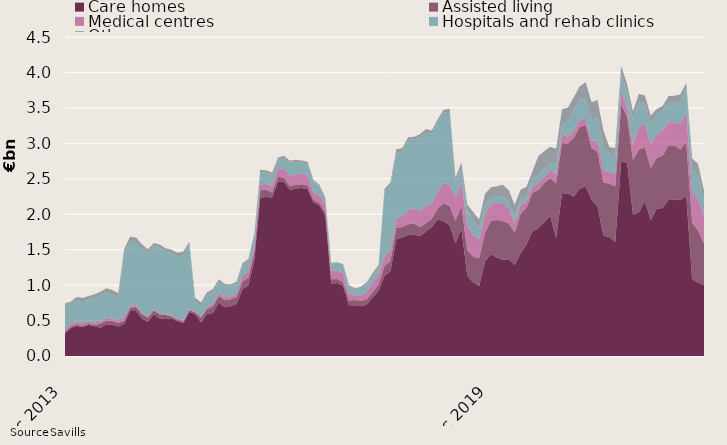
| Category | Care homes | Assisted living | Medical centres | Hospitals and rehab clinics | Other |
|---|---|---|---|---|---|
| 2013-12-01 | 316072110 | 21150000 | 36229348 | 338787993 | 26674299 |
| 2014-01-01 | 396122000 | 21150000 | 36229348 | 301467992 | 14024299 |
| 2014-02-01 | 423017999 | 16996000 | 41229348 | 301467992 | 49024299 |
| 2014-03-01 | 409587999 | 16996000 | 33896100 | 297467994 | 60915344 |
| 2014-04-01 | 436479999 | 16996000 | 38896100 | 299927994 | 54915344 |
| 2014-05-01 | 420451999 | 12372000 | 38896100 | 345627991 | 54915344 |
| 2014-06-01 | 400251999 | 53047000 | 38896100 | 360127987 | 54915344 |
| 2014-07-01 | 447606996 | 53047000 | 35000000 | 357127989 | 63009744 |
| 2014-08-01 | 442116996 | 53047000 | 35000000 | 337739742 | 63009744 |
| 2014-09-01 | 416316995 | 46247000 | 47499999 | 307299740 | 67509743 |
| 2014-10-01 | 450246995 | 46247000 | 47499999 | 901299740 | 65760544 |
| 2014-11-01 | 633736081 | 43759854 | 35999999 | 904699738 | 65760544 |
| 2014-12-01 | 633736081 | 57759854 | 25749999 | 891599738 | 64340644 |
| 2015-01-01 | 530736081 | 57759854 | 25749999 | 891599738 | 71465644 |
| 2015-02-01 | 483168082 | 57759854 | 20749999 | 896099737 | 47465644 |
| 2015-03-01 | 584248082 | 57759854 | 20749999 | 897080987 | 35574599 |
| 2015-04-01 | 529356082 | 57759854 | 15749999 | 924420986 | 46426599 |
| 2015-05-01 | 520608080 | 57759854 | 15749999 | 878720989 | 46426599 |
| 2015-06-01 | 533256112 | 23084854 | 15749999 | 876900990 | 49446599 |
| 2015-07-01 | 490421115 | 23084854 | 15749999 | 875398489 | 52902199 |
| 2015-08-01 | 463331115 | 23084854 | 22535999 | 907658735 | 59202199 |
| 2015-09-01 | 621256115 | 25684854 | 16839999 | 894158738 | 54702200 |
| 2015-10-01 | 587326115 | 25684854 | 16839999 | 139658736 | 52047000 |
| 2015-11-01 | 471877887 | 72825922 | 16839999 | 139508737 | 52047000 |
| 2015-12-01 | 593556246 | 68890922 | 27614999 | 157908739 | 52496999 |
| 2016-01-01 | 606656246 | 93190922 | 41614999 | 153408740 | 50721998 |
| 2016-02-01 | 754539246 | 93190922 | 41614999 | 153858740 | 39721998 |
| 2016-03-01 | 687824246 | 98850422 | 41614999 | 149377489 | 39721998 |
| 2016-04-01 | 701548246 | 98850422 | 41614999 | 136827489 | 28869998 |
| 2016-05-01 | 734016248 | 98850422 | 41614999 | 136827489 | 37869998 |
| 2016-06-01 | 941523216 | 109570422 | 83842999 | 134147490 | 39449998 |
| 2016-07-01 | 997563216 | 109570422 | 83842999 | 153319989 | 28209997 |
| 2016-08-01 | 1353063216 | 109570422 | 80368999 | 163139991 | 26909995 |
| 2016-09-01 | 2236038217 | 106970422 | 78890000 | 174533091 | 31909995 |
| 2016-10-01 | 2242038217 | 106970422 | 78890000 | 160033093 | 30909995 |
| 2016-11-01 | 2237654905 | 70446953 | 92390000 | 156208094 | 32409994 |
| 2016-12-01 | 2458976545 | 74801952 | 115752000 | 118658093 | 33459994 |
| 2017-01-01 | 2457326544 | 55001951 | 125059800 | 158158090 | 28109995 |
| 2017-02-01 | 2342511544 | 55001951 | 149359800 | 178733089 | 28109995 |
| 2017-03-01 | 2363283207 | 49342451 | 149359800 | 177233090 | 28109995 |
| 2017-04-01 | 2371659207 | 49792450 | 149359800 | 159983091 | 28109995 |
| 2017-05-01 | 2351709207 | 54792450 | 149359800 | 164483090 | 19109995 |
| 2017-06-01 | 2165904207 | 38072450 | 107131800 | 154483091 | 16259995 |
| 2017-07-01 | 2122064206 | 38072450 | 107131800 | 133313092 | 14749996 |
| 2017-08-01 | 1987264211 | 38072450 | 111838800 | 93893091 | 9749998 |
| 2017-09-01 | 1022249210 | 59156450 | 121613798 | 101239339 | 11749996 |
| 2017-10-01 | 1028249210 | 59156450 | 122794094 | 101239339 | 11749996 |
| 2017-11-01 | 993351664 | 51823997 | 121994094 | 110189339 | 19607117 |
| 2017-12-01 | 717528269.65 | 64485392.34 | 91375634 | 109439340 | 20394618 |
| 2018-01-01 | 716093269.65 | 73735393.34 | 68067834 | 74639342 | 22894617 |
| 2018-02-01 | 702731268.65 | 75083233.34 | 76967834 | 100209344 | 22894617 |
| 2018-03-01 | 726239605.65 | 75083233.34 | 101967834 | 100209344 | 37894617 |
| 2018-04-01 | 823219606.65 | 74633234.34 | 134166234 | 102309343 | 37894617 |
| 2018-05-01 | 915642106.65 | 94273234.34 | 134166234 | 97809344 | 43894617 |
| 2018-06-01 | 1127762106.65 | 138273234.34 | 134166234 | 912809344 | 42144617 |
| 2018-07-01 | 1195392105.65 | 143673234.34 | 145666234 | 910309345 | 51944617 |
| 2018-08-01 | 1648382098.65 | 157723234.34 | 137647234 | 919564346 | 51944617 |
| 2018-09-01 | 1672277099.66 | 147639234.34 | 158043236 | 907324998 | 44944619 |
| 2018-10-01 | 1707357099.66 | 151089234.34 | 195391740 | 988324994 | 44944619 |
| 2018-11-01 | 1711797099.66 | 155979234.34 | 214712300 | 974149994 | 37837498 |
| 2018-12-01 | 1689070494.01 | 128897840 | 232943760 | 1040049993 | 35549998 |
| 2019-01-01 | 1756635495.01 | 115597839 | 246203760 | 1035349994 | 46839999 |
| 2019-02-01 | 1821157496.01 | 114249999 | 213003760 | 985490494 | 46839999 |
| 2019-03-01 | 1925204184.01 | 156848310 | 233003760 | 994090494 | 33089999 |
| 2019-04-01 | 1902076683.01 | 251948310 | 285155359 | 1002880494 | 33089999 |
| 2019-05-01 | 1844150183.01 | 271883310 | 295091359 | 1009130493 | 65889999 |
| 2019-06-01 | 1589330183.01 | 317883310 | 338910558 | 195630492 | 71139999 |
| 2019-07-01 | 1791050185.01 | 326550262 | 332410558 | 195630492 | 83739997 |
| 2019-08-01 | 1133390186.01 | 363547512 | 332410558 | 222875492 | 83739997 |
| 2019-09-01 | 1035775186 | 363547512 | 308580808 | 217521492 | 105439996 |
| 2019-10-01 | 988695186 | 389797512 | 270052008 | 148221496 | 128973996 |
| 2019-11-01 | 1337476185 | 403512512 | 250531448 | 148518696 | 147173996 |
| 2019-12-01 | 1436021186 | 471912512 | 231531448 | 92118696 | 150234746 |
| 2020-01-01 | 1386087141 | 533140013 | 245211448 | 92118696 | 137444745 |
| 2020-02-01 | 1358892933.36 | 541184833 | 256248136 | 96033196 | 162444745 |
| 2020-03-01 | 1359571245.36 | 509586522 | 211248136 | 91933195 | 164594745 |
| 2020-04-01 | 1285138745.36 | 455118522 | 136898136 | 90543196 | 164594745 |
| 2020-05-01 | 1447483164.36 | 559543521.96 | 126962136 | 84293197 | 125794745 |
| 2020-06-01 | 1572243164.36 | 518143521.96 | 89556937 | 82793198 | 124044744 |
| 2020-07-01 | 1757903270.73 | 545381569.96 | 84556937 | 113523198 | 101644746 |
| 2020-08-01 | 1803513271.73 | 538816589.45 | 102061337 | 103523197 | 274144745 |
| 2020-09-01 | 1888440256.54 | 547632192.28 | 90395087 | 109677196 | 252444746 |
| 2020-10-01 | 1978180292 | 533682192.28 | 111995087 | 97977196 | 228910746 |
| 2020-11-01 | 1665039293 | 767307192.28 | 130112487 | 152879995 | 208460747 |
| 2020-12-01 | 2294464292.86 | 710807192.28 | 124112487 | 143379996 | 207709997 |
| 2021-01-01 | 2291797829.77 | 704629692.28 | 97172487 | 205879995 | 206709998 |
| 2021-02-01 | 2251486125.17 | 827692871.28 | 93575799 | 290996995 | 185699998 |
| 2021-03-01 | 2364136125.17 | 868373933.64 | 100275799 | 286496996 | 184924998 |
| 2021-04-01 | 2389616124.17 | 864137936.64 | 90275800 | 276996996 | 240479998 |
| 2021-05-01 | 2208345705.17 | 724537936.68 | 108436800 | 287996996 | 249129998 |
| 2021-06-01 | 2107366705.17 | 772837936.68 | 155468800 | 321096995 | 253629997 |
| 2021-07-01 | 1698576598.8 | 753200536.68 | 178048800 | 296675495 | 253629997 |
| 2021-08-01 | 1673497598.8 | 755702523.19 | 164044400 | 265675496 | 87993998 |
| 2021-09-01 | 1610965613.99 | 782639920.36 | 169174400 | 258375497 | 111193997 |
| 2021-10-01 | 2735891584.78 | 812109920.36 | 163574400 | 269475497 | 114793997 |
| 2021-11-01 | 2730991584.78 | 639669920.36 | 132957000 | 219275497 | 114793997 |
| 2021-12-01 | 1991871584.92 | 777569920.36 | 200597800 | 364207997 | 118483997 |
| 2022-01-01 | 2027177093.01 | 886182354.36 | 316627799 | 344707998 | 122995997 |
| 2022-02-01 | 2181438858.57 | 762274355.36 | 340687798 | 271440998 | 120005996 |
| 2022-03-01 | 1913613857.57 | 739518293 | 333987798 | 276440998 | 127580995 |
| 2022-04-01 | 2073471001.57 | 719122290 | 339862798 | 279620998 | 72025995 |
| 2022-05-01 | 2087852501.57 | 737359790 | 352709298 | 286620998 | 63375995 |
| 2022-06-01 | 2201316501.57 | 768679139 | 324546350.59 | 278245999 | 95975997 |
| 2022-07-01 | 2207878295.57 | 762639744 | 326355100.59 | 271937499 | 103652497 |
| 2022-08-01 | 2197942295.57 | 715655488 | 358855100.59 | 320237499 | 96788497 |
| 2022-09-01 | 2260309852.07 | 760109931.47 | 423725100.57 | 332737499 | 73588498 |
| 2022-10-01 | 1078818845.82 | 802539930.45 | 428725100.57 | 321637499 | 157293498 |
| 2022-11-01 | 1036133845.82 | 734779930.45 | 442525100.57 | 336637500 | 157293498 |
| 2022-12-01 | 1002833845.82 | 584979930.45 | 397384300.57 | 193505000 | 151293498 |